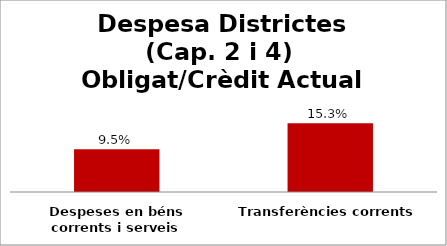
| Category | Series 0 |
|---|---|
| Despeses en béns corrents i serveis | 0.095 |
| Transferències corrents | 0.153 |